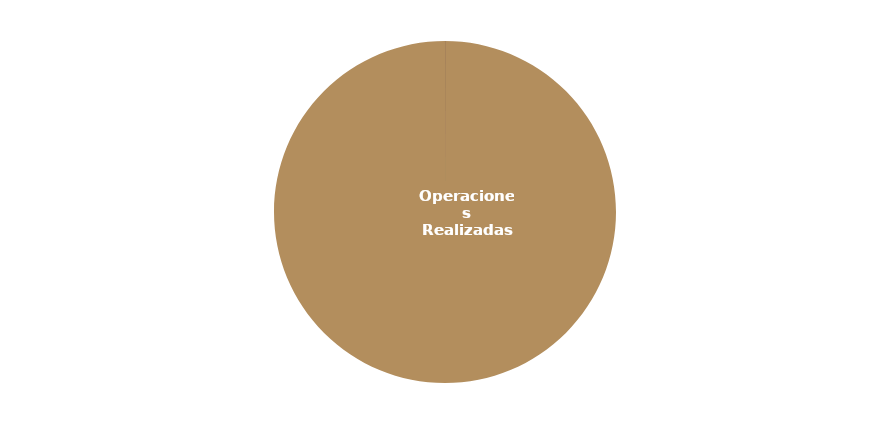
| Category | Cancelaciones |
|---|---|
| Operaciones Realizadas | 4010 |
| No Imputables | 0 |